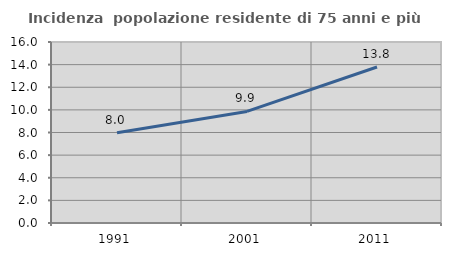
| Category | Incidenza  popolazione residente di 75 anni e più |
|---|---|
| 1991.0 | 7.981 |
| 2001.0 | 9.862 |
| 2011.0 | 13.789 |